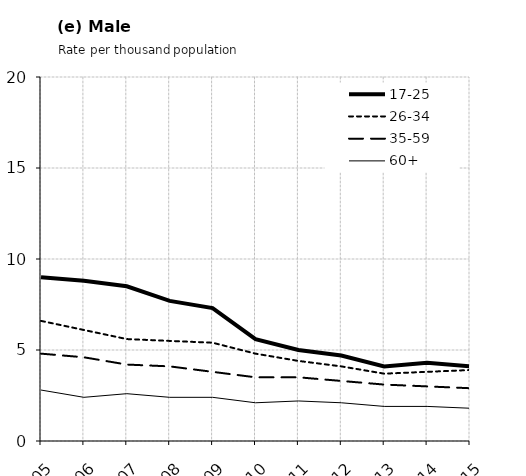
| Category | 17-25 | 26-34 | 35-59 | 60+ |
|---|---|---|---|---|
| 2005.0 | 9 | 6.6 | 4.8 | 2.8 |
| 2006.0 | 8.8 | 6.1 | 4.6 | 2.4 |
| 2007.0 | 8.5 | 5.6 | 4.2 | 2.6 |
| 2008.0 | 7.7 | 5.5 | 4.1 | 2.4 |
| 2009.0 | 7.3 | 5.4 | 3.8 | 2.4 |
| 2010.0 | 5.6 | 4.8 | 3.5 | 2.1 |
| 2011.0 | 5 | 4.4 | 3.5 | 2.2 |
| 2012.0 | 4.7 | 4.1 | 3.3 | 2.1 |
| 2013.0 | 4.1 | 3.7 | 3.1 | 1.9 |
| 2014.0 | 4.3 | 3.8 | 3 | 1.9 |
| 2015.0 | 4.1 | 3.9 | 2.9 | 1.8 |